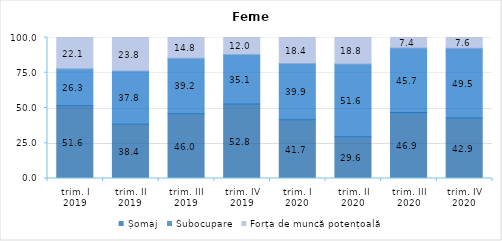
| Category | Șomaj | Subocupare | Forța de muncă potențoală |
|---|---|---|---|
| trim. I
2019 | 51.65 | 26.255 | 22.095 |
| trim. II
2019 | 38.443 | 37.796 | 23.76 |
| trim. III
2019 | 46.007 | 39.205 | 14.788 |
| trim. IV
2019 | 52.831 | 35.144 | 12.025 |
| trim. I
2020 | 41.7 | 39.878 | 18.422 |
| trim. II
2020 | 29.585 | 51.628 | 18.787 |
| trim. III
2020 | 46.895 | 45.726 | 7.379 |
| trim. IV
2020 | 42.857 | 49.524 | 7.619 |